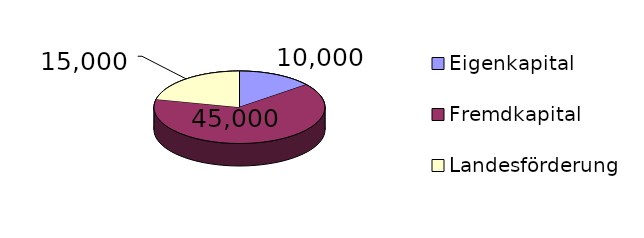
| Category | Betrag |
|---|---|
| Eigenkapital | 10000 |
| Fremdkapital | 45000 |
| Landesförderung | 15000 |